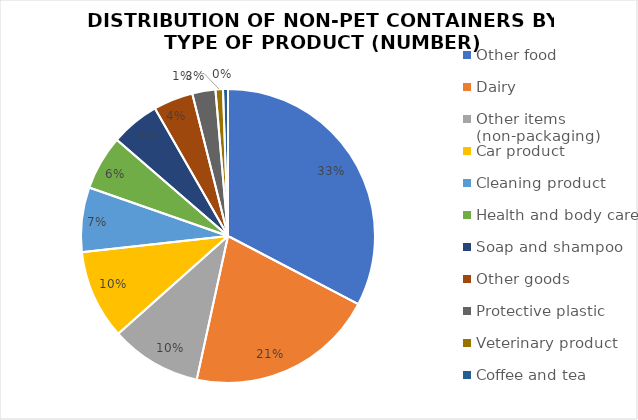
| Category | Series 1 |
|---|---|
| Other food | 359 |
| Dairy | 228 |
| Other items (non-packaging) | 110 |
| Car product | 108 |
| Cleaning product | 78 |
| Health and body care | 66 |
| Soap and shampoo | 59 |
| Other goods | 48 |
| Protective plastic | 28 |
| Veterinary product | 9 |
| Coffee and tea | 6 |